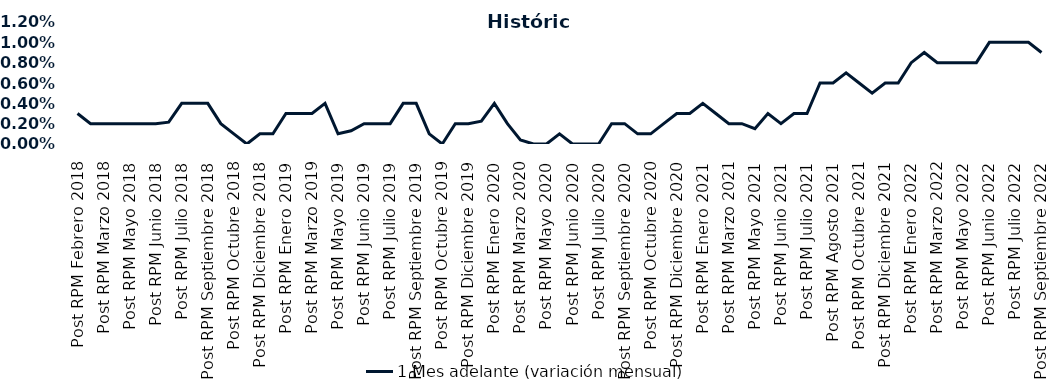
| Category | 1 Mes adelante (variación mensual) |
|---|---|
| Post RPM Febrero 2018 | 0.003 |
| Pre RPM Marzo 2018 | 0.002 |
| Post RPM Marzo 2018 | 0.002 |
| Pre RPM Mayo 2018 | 0.002 |
| Post RPM Mayo 2018 | 0.002 |
| Pre RPM Junio 2018 | 0.002 |
| Post RPM Junio 2018 | 0.002 |
| Pre RPM Julio 2018 | 0.002 |
| Post RPM Julio 2018 | 0.004 |
| Pre RPM Septiembre 2018 | 0.004 |
| Post RPM Septiembre 2018 | 0.004 |
| Pre RPM Octubre 2018 | 0.002 |
| Post RPM Octubre 2018 | 0.001 |
| Pre RPM Diciembre 2018 | 0 |
| Post RPM Diciembre 2018 | 0.001 |
| Pre RPM Enero 2019 | 0.001 |
| Post RPM Enero 2019 | 0.003 |
| Pre RPM Marzo 2019 | 0.003 |
| Post RPM Marzo 2019 | 0.003 |
| Pre RPM Mayo 2019 | 0.004 |
| Post RPM Mayo 2019 | 0.001 |
| Pre RPM Junio 2019 | 0.001 |
| Post RPM Junio 2019 | 0.002 |
| Pre RPM Julio 2019 | 0.002 |
| Post RPM Julio 2019 | 0.002 |
| Pre RPM Septiembre 2019 | 0.004 |
| Post RPM Septiembre 2019 | 0.004 |
| Pre RPM Octubre 2019 | 0.001 |
| Post RPM Octubre 2019 | 0 |
| Pre RPM Diciembre 2019 | 0.002 |
| Post RPM Diciembre 2019 | 0.002 |
| Pre RPM Enero 2020 | 0.002 |
| Post RPM Enero 2020 | 0.004 |
| Pre RPM Marzo 2020 | 0.002 |
| Post RPM Marzo 2020 | 0 |
| Pre RPM Mayo 2020 | 0 |
| Post RPM Mayo 2020 | 0 |
| Pre RPM Junio 2020 | 0.001 |
| Post RPM Junio 2020 | 0 |
| Pre RPM Julio 2020 | 0 |
| Post RPM Julio 2020 | 0 |
| Pre RPM Septiembre 2020 | 0.002 |
| Post RPM Septiembre 2020 | 0.002 |
| Pre RPM Octubre 2020 | 0.001 |
| Post RPM Octubre 2020 | 0.001 |
| Pre RPM Diciembre 2020 | 0.002 |
| Post RPM Diciembre 2020 | 0.003 |
| Pre RPM Enero 2021 | 0.003 |
| Post RPM Enero 2021 | 0.004 |
| Pre RPM Marzo 2021 | 0.003 |
| Post RPM Marzo 2021 | 0.002 |
| Pre RPM Mayo 2021 | 0.002 |
| Post RPM Mayo 2021 | 0.002 |
| Pre RPM Junio 2021 | 0.003 |
| Post RPM Junio 2021 | 0.002 |
| Pre RPM Julio 2021 | 0.003 |
| Post RPM Julio 2021 | 0.003 |
| Pre RPM Agosto 2021 | 0.006 |
| Post RPM Agosto 2021 | 0.006 |
| Pre RPM Octubre 2021 | 0.007 |
| Post RPM Octubre 2021 | 0.006 |
| Pre RPM Diciembre 2021 | 0.005 |
| Post RPM Diciembre 2021 | 0.006 |
| Pre RPM Enero 2022 | 0.006 |
| Post RPM Enero 2022 | 0.008 |
| Pre RPM Marzo 2022 | 0.009 |
| Post RPM Marzo 2022 | 0.008 |
| Pre RPM Mayo 2022 | 0.008 |
| Post RPM Mayo 2022 | 0.008 |
| Pre RPM Junio 2022 | 0.008 |
| Post RPM Junio 2022 | 0.01 |
| Pre RPM Julio 2022 | 0.01 |
| Post RPM Julio 2022 | 0.01 |
| Pre RPM Septiembre 2022 | 0.01 |
| Post RPM Septiembre 2022 | 0.009 |